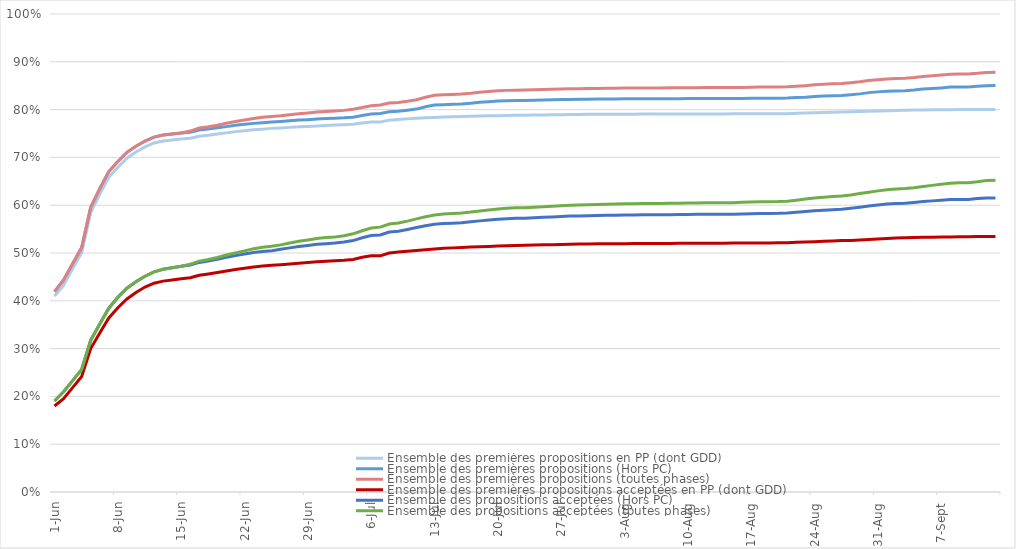
| Category | Ensemble des premières propositions en PP (dont GDD) | Ensemble des premières propositions (Hors PC) | Ensemble des premières propositions (toutes phases) | Ensemble des premières propositions acceptées en PP (dont GDD) | Ensemble des propositions acceptées (Hors PC) | Ensemble des propositions acceptées (toutes phases) |
|---|---|---|---|---|---|---|
| 2023-06-01 | 0.41 | 0.419 | 0.419 | 0.18 | 0.19 | 0.19 |
| 2023-06-02 | 0.433 | 0.444 | 0.444 | 0.195 | 0.21 | 0.21 |
| 2023-06-03 | 0.467 | 0.478 | 0.478 | 0.218 | 0.233 | 0.233 |
| 2023-06-04 | 0.501 | 0.512 | 0.512 | 0.242 | 0.256 | 0.256 |
| 2023-06-05 | 0.585 | 0.596 | 0.596 | 0.3 | 0.318 | 0.318 |
| 2023-06-06 | 0.623 | 0.635 | 0.635 | 0.332 | 0.351 | 0.351 |
| 2023-06-07 | 0.659 | 0.67 | 0.67 | 0.364 | 0.385 | 0.385 |
| 2023-06-08 | 0.679 | 0.691 | 0.691 | 0.385 | 0.407 | 0.407 |
| 2023-06-09 | 0.698 | 0.711 | 0.711 | 0.404 | 0.426 | 0.426 |
| 2023-06-10 | 0.711 | 0.723 | 0.723 | 0.418 | 0.44 | 0.44 |
| 2023-06-11 | 0.722 | 0.734 | 0.734 | 0.429 | 0.451 | 0.451 |
| 2023-06-12 | 0.73 | 0.742 | 0.742 | 0.437 | 0.461 | 0.461 |
| 2023-06-13 | 0.734 | 0.747 | 0.747 | 0.441 | 0.466 | 0.466 |
| 2023-06-14 | 0.736 | 0.749 | 0.749 | 0.444 | 0.469 | 0.469 |
| 2023-06-15 | 0.738 | 0.751 | 0.751 | 0.446 | 0.472 | 0.472 |
| 2023-06-16 | 0.74 | 0.753 | 0.755 | 0.448 | 0.475 | 0.476 |
| 2023-06-17 | 0.744 | 0.757 | 0.761 | 0.453 | 0.48 | 0.483 |
| 2023-06-18 | 0.746 | 0.759 | 0.764 | 0.456 | 0.483 | 0.486 |
| 2023-06-19 | 0.749 | 0.762 | 0.767 | 0.459 | 0.487 | 0.491 |
| 2023-06-20 | 0.751 | 0.764 | 0.771 | 0.462 | 0.491 | 0.496 |
| 2023-06-21 | 0.754 | 0.767 | 0.775 | 0.465 | 0.495 | 0.5 |
| 2023-06-22 | 0.756 | 0.769 | 0.778 | 0.468 | 0.498 | 0.504 |
| 2023-06-23 | 0.758 | 0.771 | 0.781 | 0.471 | 0.501 | 0.509 |
| 2023-06-24 | 0.759 | 0.773 | 0.784 | 0.473 | 0.503 | 0.512 |
| 2023-06-25 | 0.761 | 0.774 | 0.786 | 0.474 | 0.505 | 0.514 |
| 2023-06-26 | 0.762 | 0.775 | 0.787 | 0.476 | 0.508 | 0.517 |
| 2023-06-27 | 0.763 | 0.777 | 0.789 | 0.477 | 0.511 | 0.521 |
| 2023-06-28 | 0.764 | 0.778 | 0.791 | 0.479 | 0.513 | 0.524 |
| 2023-06-29 | 0.765 | 0.779 | 0.793 | 0.48 | 0.516 | 0.527 |
| 2023-06-30 | 0.766 | 0.78 | 0.795 | 0.481 | 0.518 | 0.53 |
| 2023-07-01 | 0.767 | 0.781 | 0.796 | 0.483 | 0.519 | 0.532 |
| 2023-07-02 | 0.768 | 0.782 | 0.797 | 0.484 | 0.521 | 0.534 |
| 2023-07-03 | 0.768 | 0.783 | 0.798 | 0.485 | 0.523 | 0.536 |
| 2023-07-04 | 0.769 | 0.784 | 0.801 | 0.487 | 0.526 | 0.54 |
| 2023-07-05 | 0.772 | 0.788 | 0.805 | 0.491 | 0.532 | 0.547 |
| 2023-07-06 | 0.774 | 0.791 | 0.808 | 0.494 | 0.537 | 0.552 |
| 2023-07-07 | 0.774 | 0.792 | 0.81 | 0.494 | 0.538 | 0.554 |
| 2023-07-08 | 0.778 | 0.795 | 0.814 | 0.5 | 0.544 | 0.561 |
| 2023-07-09 | 0.779 | 0.796 | 0.815 | 0.502 | 0.546 | 0.563 |
| 2023-07-10 | 0.781 | 0.799 | 0.818 | 0.504 | 0.549 | 0.567 |
| 2023-07-11 | 0.782 | 0.801 | 0.821 | 0.505 | 0.553 | 0.571 |
| 2023-07-12 | 0.783 | 0.806 | 0.826 | 0.507 | 0.557 | 0.576 |
| 2023-07-13 | 0.784 | 0.809 | 0.83 | 0.508 | 0.56 | 0.58 |
| 2023-07-14 | 0.784 | 0.81 | 0.831 | 0.51 | 0.562 | 0.581 |
| 2023-07-15 | 0.785 | 0.811 | 0.832 | 0.511 | 0.562 | 0.583 |
| 2023-07-16 | 0.786 | 0.812 | 0.833 | 0.512 | 0.563 | 0.584 |
| 2023-07-17 | 0.786 | 0.813 | 0.834 | 0.512 | 0.565 | 0.586 |
| 2023-07-18 | 0.787 | 0.815 | 0.837 | 0.513 | 0.567 | 0.588 |
| 2023-07-19 | 0.787 | 0.817 | 0.838 | 0.514 | 0.569 | 0.59 |
| 2023-07-20 | 0.787 | 0.818 | 0.839 | 0.514 | 0.571 | 0.592 |
| 2023-07-21 | 0.788 | 0.819 | 0.84 | 0.515 | 0.572 | 0.594 |
| 2023-07-22 | 0.788 | 0.819 | 0.841 | 0.516 | 0.573 | 0.594 |
| 2023-07-23 | 0.788 | 0.819 | 0.841 | 0.516 | 0.573 | 0.595 |
| 2023-07-24 | 0.789 | 0.82 | 0.842 | 0.517 | 0.574 | 0.596 |
| 2023-07-25 | 0.789 | 0.82 | 0.842 | 0.517 | 0.575 | 0.597 |
| 2023-07-26 | 0.789 | 0.821 | 0.843 | 0.517 | 0.575 | 0.598 |
| 2023-07-27 | 0.789 | 0.821 | 0.843 | 0.518 | 0.576 | 0.599 |
| 2023-07-28 | 0.79 | 0.821 | 0.843 | 0.518 | 0.577 | 0.6 |
| 2023-07-29 | 0.79 | 0.822 | 0.844 | 0.519 | 0.578 | 0.601 |
| 2023-07-30 | 0.79 | 0.822 | 0.844 | 0.519 | 0.578 | 0.601 |
| 2023-07-31 | 0.79 | 0.822 | 0.844 | 0.519 | 0.578 | 0.601 |
| 2023-08-01 | 0.79 | 0.822 | 0.845 | 0.519 | 0.579 | 0.602 |
| 2023-08-02 | 0.79 | 0.822 | 0.845 | 0.519 | 0.579 | 0.602 |
| 2023-08-03 | 0.79 | 0.822 | 0.845 | 0.52 | 0.579 | 0.603 |
| 2023-08-04 | 0.791 | 0.823 | 0.845 | 0.52 | 0.58 | 0.603 |
| 2023-08-05 | 0.791 | 0.823 | 0.845 | 0.52 | 0.58 | 0.603 |
| 2023-08-06 | 0.791 | 0.823 | 0.845 | 0.52 | 0.58 | 0.603 |
| 2023-08-07 | 0.791 | 0.823 | 0.845 | 0.52 | 0.58 | 0.604 |
| 2023-08-08 | 0.791 | 0.823 | 0.846 | 0.52 | 0.58 | 0.604 |
| 2023-08-09 | 0.791 | 0.823 | 0.846 | 0.52 | 0.58 | 0.604 |
| 2023-08-10 | 0.791 | 0.823 | 0.846 | 0.52 | 0.581 | 0.604 |
| 2023-08-11 | 0.791 | 0.823 | 0.846 | 0.52 | 0.581 | 0.605 |
| 2023-08-12 | 0.791 | 0.823 | 0.846 | 0.521 | 0.581 | 0.605 |
| 2023-08-13 | 0.791 | 0.823 | 0.846 | 0.521 | 0.581 | 0.605 |
| 2023-08-14 | 0.791 | 0.823 | 0.846 | 0.521 | 0.581 | 0.605 |
| 2023-08-15 | 0.791 | 0.823 | 0.846 | 0.521 | 0.581 | 0.605 |
| 2023-08-16 | 0.791 | 0.823 | 0.846 | 0.521 | 0.582 | 0.606 |
| 2023-08-17 | 0.791 | 0.824 | 0.847 | 0.521 | 0.582 | 0.607 |
| 2023-08-18 | 0.791 | 0.824 | 0.847 | 0.521 | 0.583 | 0.607 |
| 2023-08-19 | 0.791 | 0.824 | 0.847 | 0.521 | 0.583 | 0.607 |
| 2023-08-20 | 0.791 | 0.824 | 0.847 | 0.521 | 0.583 | 0.608 |
| 2023-08-21 | 0.792 | 0.824 | 0.848 | 0.521 | 0.584 | 0.608 |
| 2023-08-22 | 0.792 | 0.825 | 0.849 | 0.522 | 0.585 | 0.611 |
| 2023-08-23 | 0.793 | 0.826 | 0.85 | 0.523 | 0.587 | 0.613 |
| 2023-08-24 | 0.793 | 0.827 | 0.852 | 0.524 | 0.588 | 0.615 |
| 2023-08-25 | 0.794 | 0.828 | 0.853 | 0.524 | 0.59 | 0.617 |
| 2023-08-26 | 0.794 | 0.829 | 0.854 | 0.525 | 0.591 | 0.618 |
| 2023-08-27 | 0.795 | 0.83 | 0.855 | 0.526 | 0.591 | 0.619 |
| 2023-08-28 | 0.795 | 0.831 | 0.856 | 0.526 | 0.593 | 0.621 |
| 2023-08-29 | 0.796 | 0.833 | 0.858 | 0.527 | 0.596 | 0.624 |
| 2023-08-30 | 0.797 | 0.836 | 0.861 | 0.528 | 0.598 | 0.627 |
| 2023-08-31 | 0.797 | 0.837 | 0.863 | 0.529 | 0.601 | 0.63 |
| 2023-09-01 | 0.798 | 0.838 | 0.864 | 0.53 | 0.603 | 0.633 |
| 2023-09-02 | 0.798 | 0.839 | 0.865 | 0.531 | 0.603 | 0.634 |
| 2023-09-03 | 0.799 | 0.84 | 0.866 | 0.532 | 0.604 | 0.635 |
| 2023-09-04 | 0.799 | 0.841 | 0.867 | 0.532 | 0.606 | 0.637 |
| 2023-09-05 | 0.799 | 0.843 | 0.869 | 0.533 | 0.608 | 0.639 |
| 2023-09-06 | 0.8 | 0.844 | 0.871 | 0.533 | 0.609 | 0.641 |
| 2023-09-07 | 0.8 | 0.845 | 0.872 | 0.533 | 0.61 | 0.644 |
| 2023-09-08 | 0.8 | 0.847 | 0.874 | 0.534 | 0.612 | 0.646 |
| 2023-09-09 | 0.8 | 0.847 | 0.875 | 0.534 | 0.612 | 0.647 |
| 2023-09-10 | 0.8 | 0.847 | 0.875 | 0.534 | 0.612 | 0.647 |
| 2023-09-11 | 0.8 | 0.849 | 0.876 | 0.534 | 0.614 | 0.649 |
| 2023-09-12 | 0.8 | 0.85 | 0.878 | 0.535 | 0.615 | 0.652 |
| 2023-09-13 | 0.8 | 0.85 | 0.878 | 0.535 | 0.615 | 0.652 |